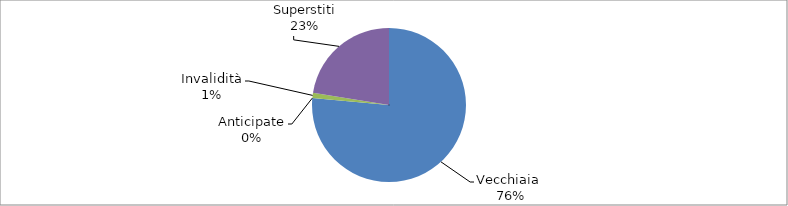
| Category | Series 0 |
|---|---|
| Vecchiaia  | 28541 |
| Anticipate | 0 |
| Invalidità | 421 |
| Superstiti | 8383 |